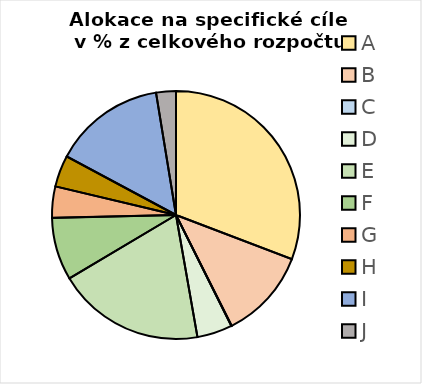
| Category | Series 0 |
|---|---|
| A | 0.308 |
| B | 0.118 |
| C | 0 |
| D | 0.046 |
| E | 0.192 |
| F | 0.082 |
| G | 0.041 |
| H | 0.041 |
| I | 0.146 |
| J | 0.026 |